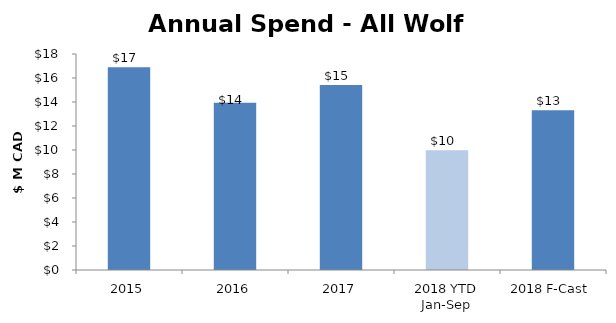
| Category | Total |
|---|---|
| 2015 | 16891071 |
| 2016 | 13945417 |
| 2017 | 15412442.75 |
| 2018 YTD Jan-Sep | 9979064.04 |
| 2018 F-Cast | 13305418.72 |